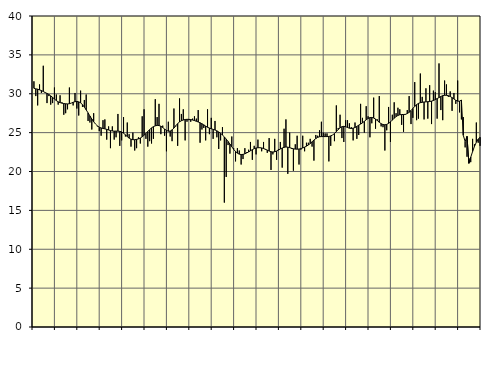
| Category | Piggar | Series 1 |
|---|---|---|
| nan | 31.6 | 30.7 |
| 1.0 | 29.7 | 30.63 |
| 1.0 | 28.5 | 30.59 |
| 1.0 | 31.2 | 30.5 |
| 1.0 | 30.1 | 30.41 |
| 1.0 | 33.6 | 30.29 |
| 1.0 | 30.2 | 30.16 |
| 1.0 | 28.8 | 30.04 |
| 1.0 | 29.7 | 29.91 |
| 1.0 | 28.6 | 29.73 |
| 1.0 | 28.8 | 29.53 |
| 1.0 | 30.8 | 29.32 |
| nan | 29.9 | 29.12 |
| 2.0 | 28.6 | 28.96 |
| 2.0 | 29.8 | 28.86 |
| 2.0 | 28.9 | 28.79 |
| 2.0 | 27.3 | 28.74 |
| 2.0 | 27.5 | 28.71 |
| 2.0 | 28 | 28.69 |
| 2.0 | 30.8 | 28.72 |
| 2.0 | 28.8 | 28.8 |
| 2.0 | 28.5 | 28.9 |
| 2.0 | 30.1 | 28.98 |
| 2.0 | 28.1 | 29.01 |
| nan | 27.2 | 28.96 |
| 3.0 | 30.4 | 28.83 |
| 3.0 | 28.3 | 28.6 |
| 3.0 | 29.2 | 28.29 |
| 3.0 | 29.9 | 27.93 |
| 3.0 | 26.5 | 27.54 |
| 3.0 | 26.3 | 27.14 |
| 3.0 | 25.4 | 26.75 |
| 3.0 | 27.5 | 26.4 |
| 3.0 | 26.1 | 26.1 |
| 3.0 | 25.8 | 25.87 |
| 3.0 | 25.2 | 25.7 |
| nan | 24.6 | 25.6 |
| 4.0 | 26.6 | 25.54 |
| 4.0 | 26.7 | 25.48 |
| 4.0 | 24.1 | 25.42 |
| 4.0 | 25.8 | 25.34 |
| 4.0 | 23 | 25.26 |
| 4.0 | 25.8 | 25.21 |
| 4.0 | 24.1 | 25.19 |
| 4.0 | 24.4 | 25.2 |
| 4.0 | 27.4 | 25.19 |
| 4.0 | 23.3 | 25.16 |
| 4.0 | 24 | 25.09 |
| nan | 27 | 24.93 |
| 5.0 | 24.5 | 24.72 |
| 5.0 | 26.3 | 24.49 |
| 5.0 | 24.8 | 24.29 |
| 5.0 | 23.2 | 24.15 |
| 5.0 | 25 | 24.09 |
| 5.0 | 22.7 | 24.09 |
| 5.0 | 23 | 24.13 |
| 5.0 | 24.4 | 24.2 |
| 5.0 | 23.6 | 24.31 |
| 5.0 | 27.1 | 24.46 |
| 5.0 | 28 | 24.66 |
| nan | 24.2 | 24.9 |
| 6.0 | 23.2 | 25.15 |
| 6.0 | 23.9 | 25.39 |
| 6.0 | 23.6 | 25.61 |
| 6.0 | 24.2 | 25.77 |
| 6.0 | 29.3 | 25.87 |
| 6.0 | 27 | 25.93 |
| 6.0 | 28.7 | 25.91 |
| 6.0 | 24.8 | 25.82 |
| 6.0 | 25.9 | 25.66 |
| 6.0 | 24.6 | 25.46 |
| 6.0 | 22.6 | 25.29 |
| nan | 26.4 | 25.18 |
| 7.0 | 24.5 | 25.2 |
| 7.0 | 23.9 | 25.35 |
| 7.0 | 28.1 | 25.59 |
| 7.0 | 25.8 | 25.89 |
| 7.0 | 23.3 | 26.16 |
| 7.0 | 29.4 | 26.38 |
| 7.0 | 27.4 | 26.53 |
| 7.0 | 28 | 26.62 |
| 7.0 | 24 | 26.69 |
| 7.0 | 26.4 | 26.71 |
| 7.0 | 26.6 | 26.71 |
| nan | 26.4 | 26.68 |
| 8.0 | 26.8 | 26.62 |
| 8.0 | 27.1 | 26.55 |
| 8.0 | 26.8 | 26.46 |
| 8.0 | 27.9 | 26.37 |
| 8.0 | 23.7 | 26.27 |
| 8.0 | 25.4 | 26.14 |
| 8.0 | 25.6 | 26 |
| 8.0 | 24 | 25.84 |
| 8.0 | 28 | 25.69 |
| 8.0 | 24.8 | 25.59 |
| 8.0 | 26.9 | 25.5 |
| nan | 24.2 | 25.42 |
| 9.0 | 26.5 | 25.34 |
| 9.0 | 24.4 | 25.23 |
| 9.0 | 22.9 | 25.09 |
| 9.0 | 24 | 24.91 |
| 9.0 | 25.7 | 24.69 |
| 9.0 | 16 | 24.45 |
| 9.0 | 19.3 | 24.17 |
| 9.0 | 23.4 | 23.86 |
| 9.0 | 22.3 | 23.53 |
| 9.0 | 24.5 | 23.18 |
| 9.0 | 23 | 22.85 |
| nan | 21.3 | 22.57 |
| 10.0 | 23 | 22.36 |
| 10.0 | 22.7 | 22.23 |
| 10.0 | 20.9 | 22.18 |
| 10.0 | 21.6 | 22.2 |
| 10.0 | 23 | 22.27 |
| 10.0 | 22.5 | 22.39 |
| 10.0 | 22.8 | 22.52 |
| 10.0 | 23.8 | 22.67 |
| 10.0 | 21.5 | 22.81 |
| 10.0 | 23.3 | 22.94 |
| 10.0 | 22.2 | 23.02 |
| nan | 24.1 | 23.06 |
| 11.0 | 23.1 | 23.06 |
| 11.0 | 22.6 | 23.03 |
| 11.0 | 23.8 | 22.96 |
| 11.0 | 22.8 | 22.86 |
| 11.0 | 22.4 | 22.75 |
| 11.0 | 24.3 | 22.63 |
| 11.0 | 20.2 | 22.54 |
| 11.0 | 22.2 | 22.51 |
| 11.0 | 24.2 | 22.54 |
| 11.0 | 21.5 | 22.63 |
| 11.0 | 22.9 | 22.75 |
| nan | 23.8 | 22.9 |
| 12.0 | 20.5 | 23.02 |
| 12.0 | 25.5 | 23.11 |
| 12.0 | 26.7 | 23.15 |
| 12.0 | 19.7 | 23.13 |
| 12.0 | 25 | 23.07 |
| 12.0 | 22.9 | 22.99 |
| 12.0 | 20.1 | 22.92 |
| 12.0 | 23.5 | 22.88 |
| 12.0 | 24.6 | 22.87 |
| 12.0 | 20.9 | 22.89 |
| 12.0 | 22.8 | 22.95 |
| nan | 24.6 | 23.03 |
| 13.0 | 22.6 | 23.13 |
| 13.0 | 23.7 | 23.26 |
| 13.0 | 23.7 | 23.41 |
| 13.0 | 24.2 | 23.59 |
| 13.0 | 23.2 | 23.82 |
| 13.0 | 21.4 | 24.04 |
| 13.0 | 24.7 | 24.24 |
| 13.0 | 24.6 | 24.39 |
| 13.0 | 25.3 | 24.47 |
| 13.0 | 26.4 | 24.49 |
| 13.0 | 25 | 24.49 |
| nan | 24.9 | 24.49 |
| 14.0 | 24.9 | 24.49 |
| 14.0 | 21.3 | 24.51 |
| 14.0 | 23.3 | 24.58 |
| 14.0 | 24.7 | 24.7 |
| 14.0 | 23.9 | 24.88 |
| 14.0 | 28.5 | 25.13 |
| 14.0 | 25.6 | 25.4 |
| 14.0 | 27.3 | 25.62 |
| 14.0 | 24.3 | 25.76 |
| 14.0 | 23.8 | 25.81 |
| 14.0 | 26.6 | 25.76 |
| nan | 26.6 | 25.66 |
| 15.0 | 26.2 | 25.57 |
| 15.0 | 25.7 | 25.53 |
| 15.0 | 24 | 25.57 |
| 15.0 | 26.3 | 25.66 |
| 15.0 | 24.2 | 25.8 |
| 15.0 | 24.7 | 25.96 |
| 15.0 | 28.7 | 26.1 |
| 15.0 | 26.9 | 26.26 |
| 15.0 | 25 | 26.45 |
| 15.0 | 28.4 | 26.65 |
| 15.0 | 27.1 | 26.82 |
| nan | 24.4 | 26.93 |
| 16.0 | 26.2 | 26.95 |
| 16.0 | 29.5 | 26.88 |
| 16.0 | 25.5 | 26.74 |
| 16.0 | 26.7 | 26.55 |
| 16.0 | 29.7 | 26.33 |
| 16.0 | 25.8 | 26.15 |
| 16.0 | 25.7 | 26.04 |
| 16.0 | 22.7 | 26.01 |
| 16.0 | 25.3 | 26.06 |
| 16.0 | 28.3 | 26.19 |
| 16.0 | 23.8 | 26.38 |
| nan | 27.3 | 26.62 |
| 17.0 | 28.9 | 26.85 |
| 17.0 | 27.5 | 27.06 |
| 17.0 | 28.2 | 27.21 |
| 17.0 | 28 | 27.3 |
| 17.0 | 26 | 27.33 |
| 17.0 | 25.1 | 27.33 |
| 17.0 | 27.3 | 27.35 |
| 17.0 | 27.9 | 27.45 |
| 17.0 | 29.7 | 27.61 |
| 17.0 | 26.1 | 27.84 |
| 17.0 | 26.9 | 28.11 |
| nan | 31.5 | 28.37 |
| 18.0 | 26.6 | 28.6 |
| 18.0 | 26.8 | 28.76 |
| 18.0 | 32.6 | 28.85 |
| 18.0 | 29.6 | 28.9 |
| 18.0 | 26.7 | 28.94 |
| 18.0 | 30.7 | 28.96 |
| 18.0 | 26.8 | 28.98 |
| 18.0 | 31.1 | 29 |
| 18.0 | 26.1 | 29.05 |
| 18.0 | 30.4 | 29.13 |
| 18.0 | 30.2 | 29.25 |
| nan | 26.8 | 29.38 |
| 19.0 | 33.9 | 29.51 |
| 19.0 | 27.9 | 29.65 |
| 19.0 | 26.6 | 29.76 |
| 19.0 | 31.7 | 29.8 |
| 19.0 | 31.2 | 29.8 |
| 19.0 | 29.6 | 29.75 |
| 19.0 | 30.3 | 29.65 |
| 19.0 | 27.8 | 29.5 |
| 19.0 | 30.1 | 29.33 |
| 19.0 | 28.7 | 29.16 |
| 19.0 | 31.7 | 29.05 |
| nan | 27.6 | 29.04 |
| 20.0 | 26.7 | 29.19 |
| 20.0 | 27 | 24.66 |
| 20.0 | 23.1 | 23.86 |
| 20.0 | 21.9 | 24.52 |
| 20.0 | 21.7 | 21.06 |
| 20.0 | 21.2 | 21.83 |
| 20.0 | 24.2 | 22.57 |
| 20.0 | 23.5 | 23.22 |
| 20.0 | 26.3 | 23.76 |
| 20.0 | 23.7 | 24.16 |
| 20.0 | 23.3 | 24.41 |